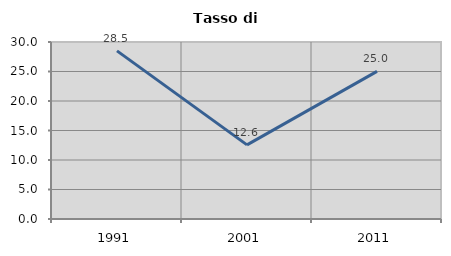
| Category | Tasso di disoccupazione   |
|---|---|
| 1991.0 | 28.495 |
| 2001.0 | 12.559 |
| 2011.0 | 25.026 |